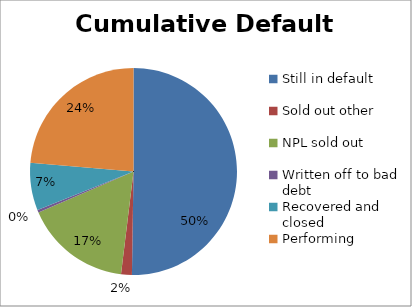
| Category | Cumulative Default Breakdown |
|---|---|
| Still in default | 0.502 |
| Sold out other | 0.017 |
| NPL sold out | 0.166 |
| Written off to bad debt | 0.004 |
| Recovered and closed | 0.074 |
| Performing | 0.237 |